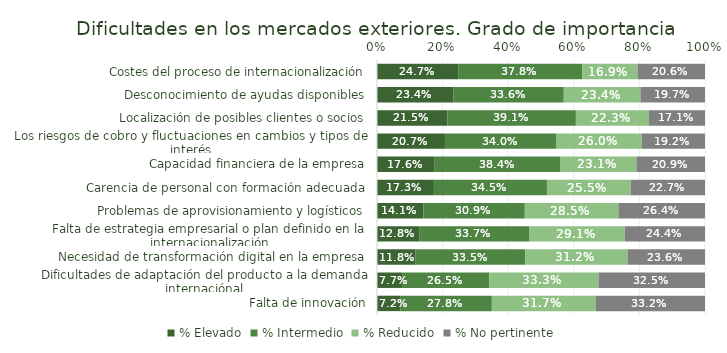
| Category | % Elevado | % Intermedio | % Reducido | % No pertinente |
|---|---|---|---|---|
| Costes del proceso de internacionalización | 0.247 | 0.378 | 0.169 | 0.206 |
| Desconocimiento de ayudas disponibles | 0.234 | 0.336 | 0.234 | 0.197 |
| Localización de posibles clientes o socios | 0.215 | 0.391 | 0.223 | 0.171 |
| Los riesgos de cobro y fluctuaciones en cambios y tipos de interés | 0.207 | 0.34 | 0.26 | 0.192 |
| Capacidad financiera de la empresa | 0.176 | 0.384 | 0.231 | 0.209 |
| Carencia de personal con formación adecuada | 0.173 | 0.345 | 0.255 | 0.227 |
| Problemas de aprovisionamiento y logísticos | 0.141 | 0.309 | 0.285 | 0.264 |
| Falta de estrategia empresarial o plan definido en la internacionalización | 0.128 | 0.337 | 0.291 | 0.244 |
| Necesidad de transformación digital en la empresa | 0.118 | 0.335 | 0.312 | 0.236 |
| Dificultades de adaptación del producto a la demanda internaciónal | 0.077 | 0.265 | 0.333 | 0.325 |
| Falta de innovación | 0.072 | 0.278 | 0.317 | 0.332 |